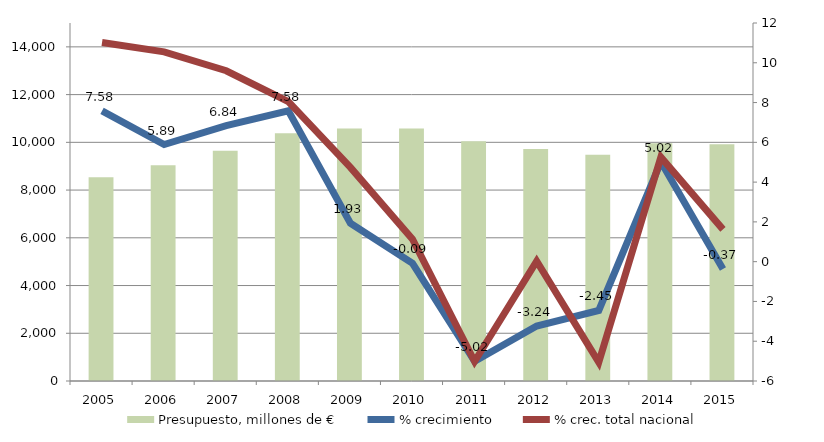
| Category | Presupuesto, millones de € |
|---|---|
| 2005.0 | 8532202 |
| 2006.0 | 9034624 |
| 2007.0 | 9652452 |
| 2008.0 | 10384241.1 |
| 2009.0 | 10584541 |
| 2010.0 | 10575537 |
| 2011.0 | 10045146 |
| 2012.0 | 9720048.42 |
| 2013.0 | 9481615.09 |
| 2014.0 | 9957790.752 |
| 2015.0 | 9920811.756 |